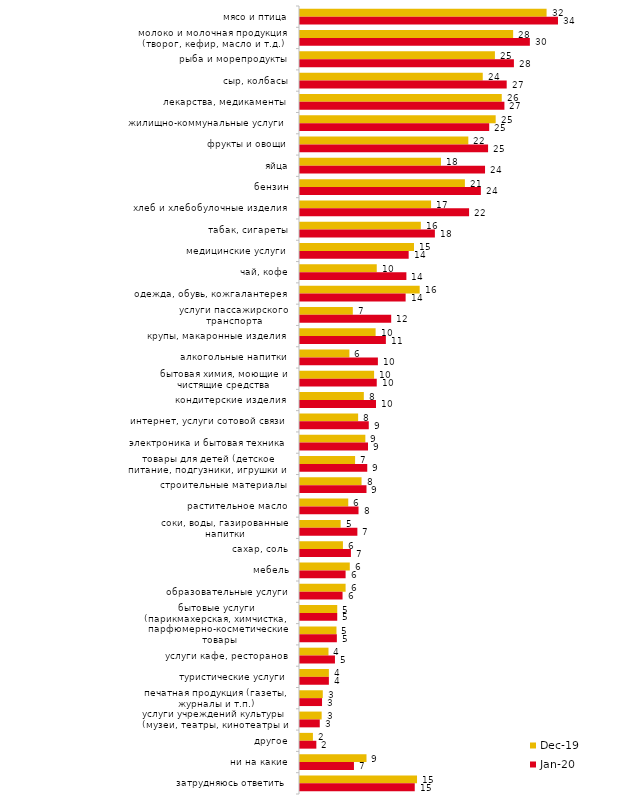
| Category | дек.19 | янв.20 |
|---|---|---|
| мясо и птица | 32.129 | 33.614 |
| молоко и молочная продукция (творог, кефир, масло и т.д.) | 27.772 | 29.95 |
| рыба и морепродукты | 25.396 | 27.871 |
| сыр, колбасы | 23.812 | 26.931 |
| лекарства, медикаменты | 26.287 | 26.634 |
| жилищно-коммунальные услуги | 25.495 | 24.653 |
| фрукты и овощи | 21.931 | 24.505 |
| яйца | 18.366 | 24.109 |
| бензин | 21.485 | 23.564 |
| хлеб и хлебобулочные изделия | 17.079 | 22.03 |
| табак, сигареты | 15.743 | 17.574 |
| медицинские услуги | 14.851 | 14.158 |
| чай, кофе | 10 | 13.861 |
| одежда, обувь, кожгалантерея | 15.594 | 13.762 |
| услуги пассажирского транспорта | 6.881 | 11.881 |
| крупы, макаронные изделия | 9.851 | 11.188 |
| алкогольные напитки | 6.436 | 10.149 |
| бытовая химия, моющие и чистящие средства | 9.653 | 10 |
| кондитерские изделия | 8.317 | 9.901 |
| интернет, услуги сотовой связи | 7.574 | 8.96 |
| электроника и бытовая техника | 8.515 | 8.861 |
| товары для детей (детское питание, подгузники, игрушки и т.п.) | 7.178 | 8.762 |
| строительные материалы | 8.02 | 8.663 |
| растительное масло | 6.287 | 7.624 |
| соки, воды, газированные напитки | 5.297 | 7.475 |
| сахар, соль | 5.594 | 6.634 |
| мебель | 6.485 | 5.941 |
| образовательные услуги | 5.941 | 5.545 |
| бытовые услуги (парикмахерская, химчистка, ателье и т.д.) | 4.851 | 4.851 |
| парфюмерно-косметические товары | 4.752 | 4.802 |
| услуги кафе, ресторанов | 3.713 | 4.554 |
| туристические услуги | 3.762 | 3.762 |
| печатная продукция (газеты, журналы и т.п.) | 2.97 | 2.871 |
| услуги учреждений культуры (музеи, театры, кинотеатры и т.п.) | 2.822 | 2.574 |
| другое | 1.683 | 2.129 |
| ни на какие | 8.663 | 7.03 |
| затрудняюсь ответить | 15.248 | 14.95 |